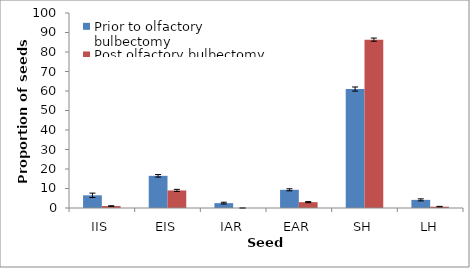
| Category | Prior to olfactory bulbectomy | Post olfactory bulbectomy |
|---|---|---|
| IIS | 6.5 | 1 |
| EIS | 16.5 | 9 |
| IAR | 2.5 | 0 |
| EAR | 9.333 | 3 |
| SH | 61 | 86.333 |
| LH | 4.167 | 0.667 |